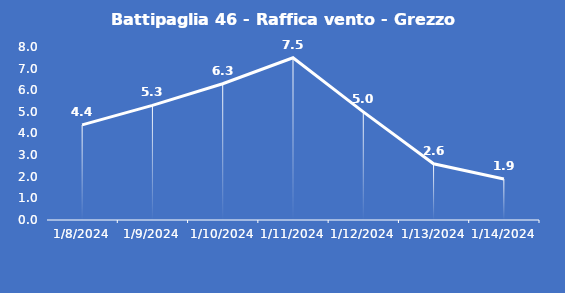
| Category | Battipaglia 46 - Raffica vento - Grezzo (m/s) |
|---|---|
| 1/8/24 | 4.4 |
| 1/9/24 | 5.3 |
| 1/10/24 | 6.3 |
| 1/11/24 | 7.5 |
| 1/12/24 | 5 |
| 1/13/24 | 2.6 |
| 1/14/24 | 1.9 |